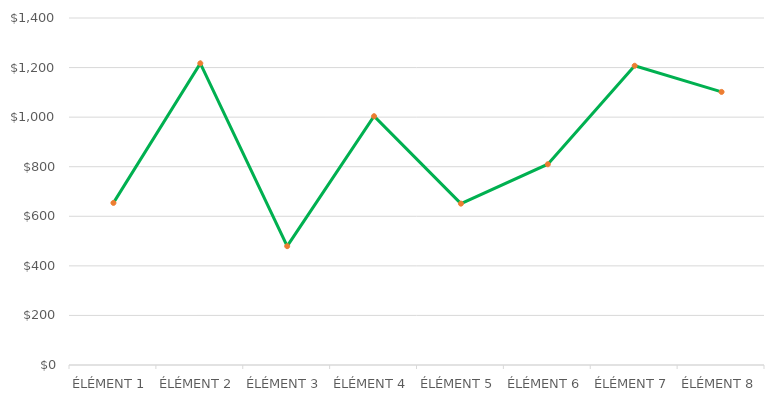
| Category | Series 1 |
|---|---|
| ÉLÉMENT 1 | 653.975 |
| ÉLÉMENT 2 | 1217.065 |
| ÉLÉMENT 3 | 479.5 |
| ÉLÉMENT 4 | 1003.75 |
| ÉLÉMENT 5 | 651 |
| ÉLÉMENT 6 | 810 |
| ÉLÉMENT 7 | 1207.25 |
| ÉLÉMENT 8 | 1101.76 |